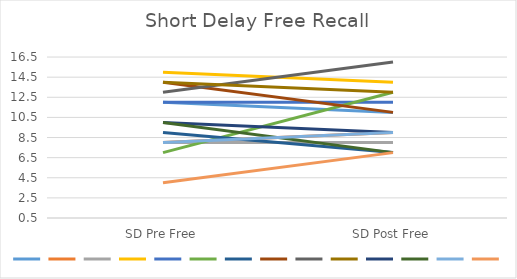
| Category | Series 0 | Series 1 | Series 2 | Series 3 | Series 4 | Series 5 | Series 6 | Series 7 | Series 8 | Series 9 | Series 10 | Series 11 | Series 12 | Series 13 |
|---|---|---|---|---|---|---|---|---|---|---|---|---|---|---|
| SD Pre Free | 12 | 8 | 8 | 15 | 12 | 7 | 9 | 14 | 13 | 14 | 10 | 10 | 8 | 4 |
| SD Post Free | 11 | 9 | 8 | 14 | 12 | 13 | 7 | 11 | 16 | 13 | 9 | 7 | 9 | 7 |